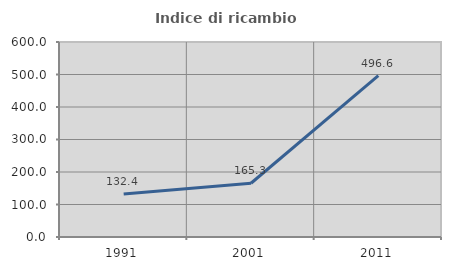
| Category | Indice di ricambio occupazionale  |
|---|---|
| 1991.0 | 132.447 |
| 2001.0 | 165.323 |
| 2011.0 | 496.552 |